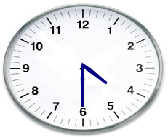
| Category | Series 0 |
|---|---|
| 0.0 | 0 |
| 0.1996588775118232 | -0.15 |
| 0.6363961030678926 | -0.636 |
| 0.15045375578801198 | -0.2 |
| 0.0 | 0 |
| 0.18867739505569298 | -0.164 |
| 0.6363961030678926 | -0.636 |
| 0.16401475724762676 | -0.189 |
| 0.0 | 0 |
| 0.017449748351250197 | -0.5 |
| -2.6646978894262485e-16 | -1.45 |
| 0.008726203218641565 | -0.5 |
| 0.0 | 0 |
| -0.01744974835125038 | -0.5 |
| -2.6646978894262485e-16 | -1.45 |
| -0.008726203218641749 | -0.5 |
| 0.0 | 0 |